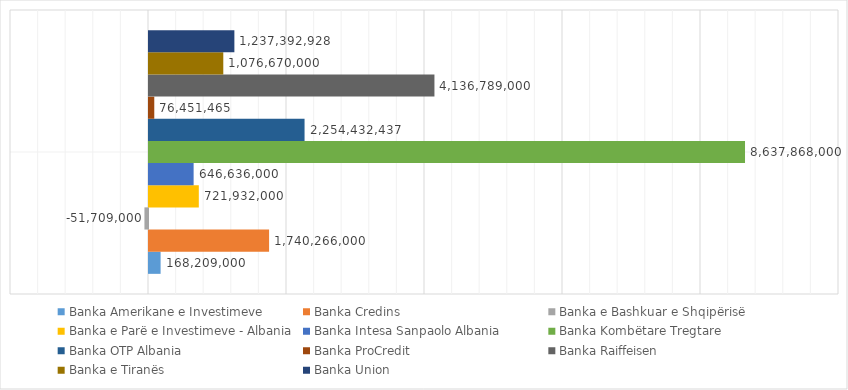
| Category | Banka Amerikane e Investimeve | Banka Credins | Banka e Bashkuar e Shqipërisë | Banka e Parë e Investimeve - Albania | Banka Intesa Sanpaolo Albania | Banka Kombëtare Tregtare | Banka OTP Albania | Banka ProCredit | Banka Raiffeisen | Banka e Tiranës | Banka Union |
|---|---|---|---|---|---|---|---|---|---|---|---|
| 0 | 168209000 | 1740266000 | -51709000 | 721932000 | 646636000 | 8637868000 | 2254432437 | 76451465 | 4136789000 | 1076670000 | 1237392928 |